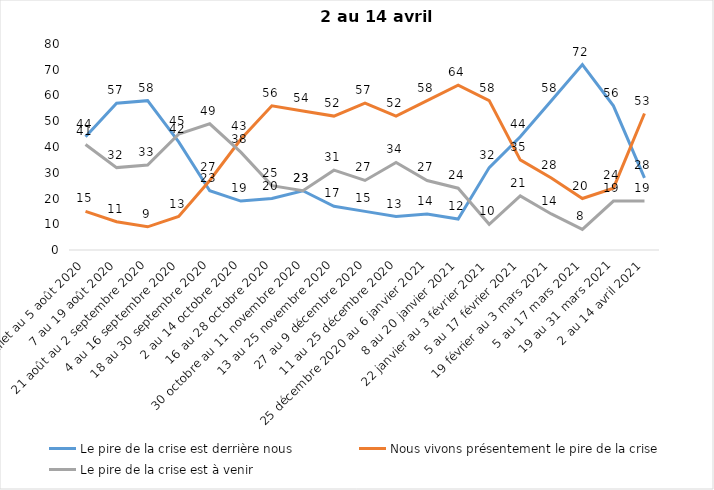
| Category | Le pire de la crise est derrière nous | Nous vivons présentement le pire de la crise | Le pire de la crise est à venir |
|---|---|---|---|
| 24 juillet au 5 août 2020 | 44 | 15 | 41 |
| 7 au 19 août 2020 | 57 | 11 | 32 |
| 21 août au 2 septembre 2020 | 58 | 9 | 33 |
| 4 au 16 septembre 2020 | 42 | 13 | 45 |
| 18 au 30 septembre 2020 | 23 | 27 | 49 |
| 2 au 14 octobre 2020 | 19 | 43 | 38 |
| 16 au 28 octobre 2020 | 20 | 56 | 25 |
| 30 octobre au 11 novembre 2020 | 23 | 54 | 23 |
| 13 au 25 novembre 2020 | 17 | 52 | 31 |
| 27 au 9 décembre 2020 | 15 | 57 | 27 |
| 11 au 25 décembre 2020 | 13 | 52 | 34 |
| 25 décembre 2020 au 6 janvier 2021 | 14 | 58 | 27 |
| 8 au 20 janvier 2021 | 12 | 64 | 24 |
| 22 janvier au 3 février 2021 | 32 | 58 | 10 |
| 5 au 17 février 2021 | 44 | 35 | 21 |
| 19 février au 3 mars 2021 | 58 | 28 | 14 |
| 5 au 17 mars 2021 | 72 | 20 | 8 |
| 19 au 31 mars 2021 | 56 | 24 | 19 |
| 2 au 14 avril 2021 | 28 | 53 | 19 |